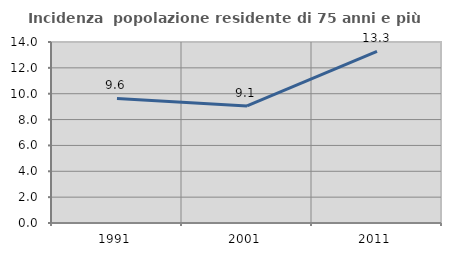
| Category | Incidenza  popolazione residente di 75 anni e più |
|---|---|
| 1991.0 | 9.632 |
| 2001.0 | 9.055 |
| 2011.0 | 13.278 |